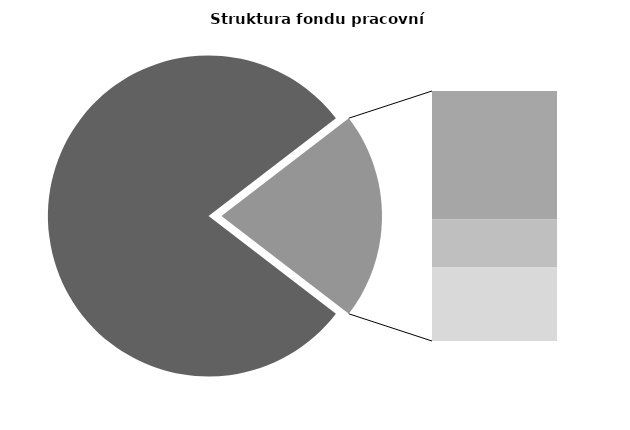
| Category | Series 0 |
|---|---|
| Průměrná měsíční odpracovaná doba bez přesčasu | 136.315 |
| Dovolená | 18.435 |
| Nemoc | 6.917 |
| Jiné | 10.548 |